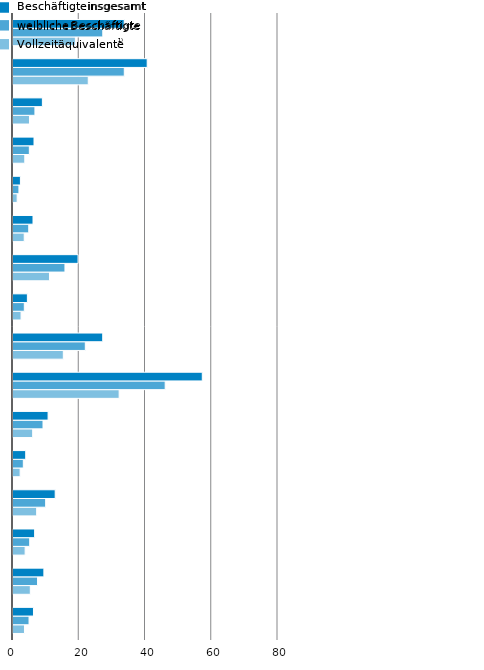
| Category | VZÄ | wB | iB |
|---|---|---|---|
| Thüringen      | 3.466 | 4.843 | 6.181 |
| Schleswig-Holstein | 5.228 | 7.415 | 9.323 |
| Sachsen-Anhalt | 3.662 | 5.046 | 6.53 |
| Sachsen        | 7.144 | 9.86 | 12.74 |
| Saarland | 2.153 | 3.114 | 3.84 |
| Rheinland-Pfalz | 5.94 | 9.058 | 10.592 |
| Nordrhein-Westfalen | 32.045 | 45.939 | 57.143 |
| Niedersachsen | 15.189 | 21.827 | 27.086 |
| Mecklenburg-Vorpommern | 2.436 | 3.414 | 4.344 |
| Hessen         | 11.013 | 15.685 | 19.639 |
| Hamburg | 3.387 | 4.753 | 6.039 |
| Bremen | 1.256 | 1.791 | 2.239 |
| Brandenburg | 3.557 | 4.93 | 6.344 |
| Berlin | 4.974 | 6.622 | 8.87 |
| Bayern | 22.719 | 33.596 | 40.512 |
| Baden-Württemberg | 18.829 | 27.107 | 33.576 |